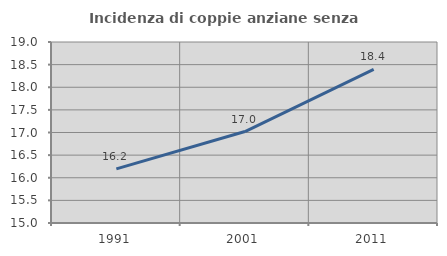
| Category | Incidenza di coppie anziane senza figli  |
|---|---|
| 1991.0 | 16.197 |
| 2001.0 | 17.021 |
| 2011.0 | 18.396 |